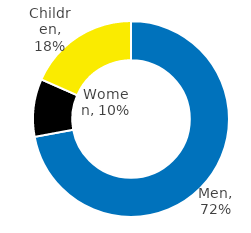
| Category | Series 0 |
|---|---|
| Men | 0.721 |
| Women | 0.095 |
| Children | 0.184 |